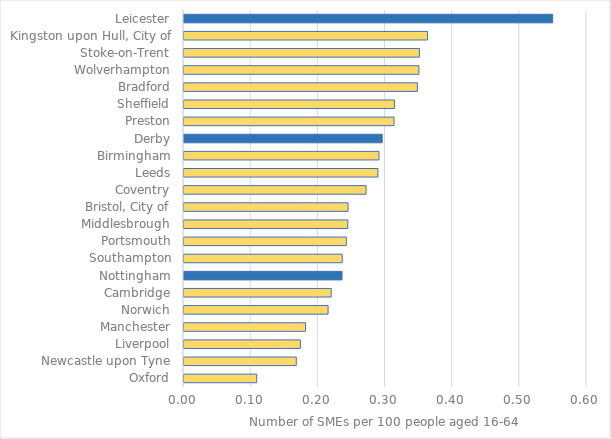
| Category | Series 0 |
|---|---|
| Oxford | 0.108 |
| Newcastle upon Tyne | 0.167 |
| Liverpool | 0.173 |
| Manchester | 0.181 |
| Norwich | 0.215 |
| Cambridge | 0.219 |
| Nottingham | 0.235 |
| Southampton | 0.236 |
| Portsmouth | 0.242 |
| Middlesbrough | 0.244 |
| Bristol, City of | 0.244 |
| Coventry | 0.271 |
| Leeds | 0.289 |
| Birmingham | 0.29 |
| Derby | 0.295 |
| Preston | 0.313 |
| Sheffield | 0.313 |
| Bradford | 0.347 |
| Wolverhampton | 0.35 |
| Stoke-on-Trent | 0.351 |
| Kingston upon Hull, City of | 0.363 |
| Leicester | 0.549 |